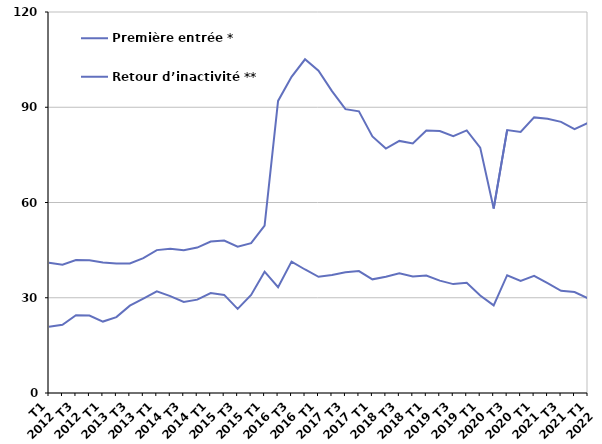
| Category | Première entrée * | Retour d’inactivité ** |
|---|---|---|
| T1
2012 | 20.9 | 41 |
| T2
2012 | 21.5 | 40.4 |
| T3
2012 | 24.5 | 41.9 |
| T4
2012 | 24.4 | 41.8 |
| T1
2013 | 22.5 | 41.1 |
| T2
2013 | 23.9 | 40.8 |
| T3
2013 | 27.5 | 40.8 |
| T4
2013 | 29.7 | 42.5 |
| T1
2014 | 32 | 45 |
| T2
2014 | 30.5 | 45.4 |
| T3
2014 | 28.7 | 45 |
| T4
2014 | 29.4 | 45.8 |
| T1
2015 | 31.5 | 47.7 |
| T2
2015 | 30.9 | 48 |
| T3
2015 | 26.5 | 46.1 |
| T4
2015 | 30.9 | 47.2 |
| T1
2016 | 38.2 | 52.7 |
| T2
2016 | 33.3 | 92 |
| T3
2016 | 41.4 | 99.6 |
| T4
2016 | 38.9 | 105.1 |
| T1
2017 | 36.6 | 101.5 |
| T2
2017 | 37.2 | 95.1 |
| T3
2017 | 38 | 89.4 |
| T4
2017 | 38.4 | 88.7 |
| T1
2018 | 35.8 | 80.8 |
| T2
2018 | 36.6 | 77 |
| T3
2018 | 37.7 | 79.4 |
| T4
2018 | 36.7 | 78.6 |
| T1
2019 | 37 | 82.7 |
| T2
2019 | 35.4 | 82.5 |
| T3
2019 | 34.3 | 80.9 |
| T4
2019 | 34.7 | 82.7 |
| T1
2020 | 30.7 | 77.3 |
| T2
2020 | 27.6 | 58.1 |
| T3
2020 | 37.1 | 82.8 |
| T4
2020 | 35.3 | 82.2 |
| T1
2021 | 36.9 | 86.8 |
| T2
2021 | 34.6 | 86.4 |
| T3
2021 | 32.2 | 85.4 |
| T4
2021 | 31.8 | 83.1 |
| T1
2022 | 29.8 | 85.1 |